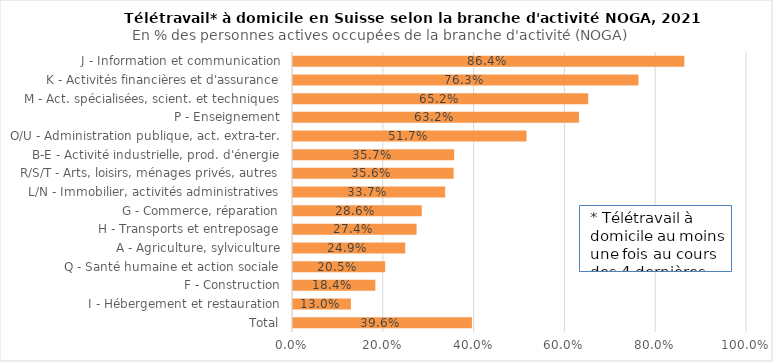
| Category | Total télétravail à domicile (2) |
|---|---|
| Total | 0.396 |
| I - Hébergement et restauration | 0.13 |
| F - Construction | 0.184 |
| Q - Santé humaine et action sociale | 0.205 |
| A - Agriculture, sylviculture | 0.249 |
| H - Transports et entreposage | 0.274 |
| G - Commerce, réparation | 0.286 |
| L/N - Immobilier, activités administratives | 0.337 |
| R/S/T - Arts, loisirs, ménages privés, autres | 0.356 |
| B-E - Activité industrielle, prod. d'énergie | 0.357 |
| O/U - Administration publique, act. extra-ter. | 0.517 |
| P - Enseignement | 0.632 |
| M - Act. spécialisées, scient. et techniques | 0.652 |
| K - Activités financières et d'assurance | 0.763 |
| J - Information et communication | 0.864 |